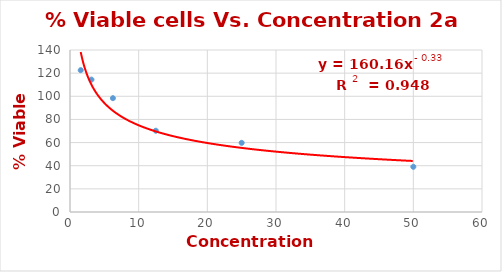
| Category | Series 0 |
|---|---|
| 50.0 | 39.07 |
| 25.0 | 59.767 |
| 12.5 | 70.233 |
| 6.25 | 98.372 |
| 3.125 | 114.419 |
| 1.5625 | 122.558 |